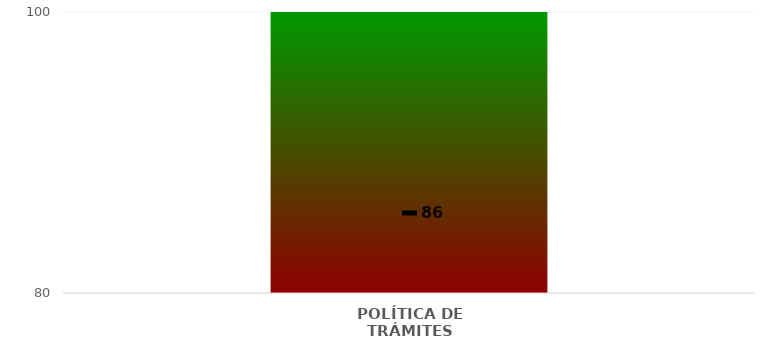
| Category | Niveles |
|---|---|
| POLÍTICA DE TRÁMITES | 100 |